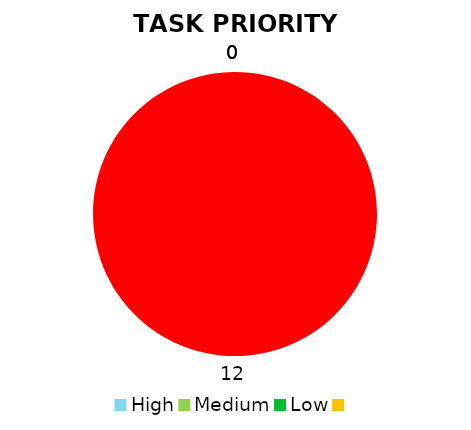
| Category | Series 1 | Series 0 |
|---|---|---|
| High | 12 | 12 |
| Medium | 0 | 0 |
| Low | 0 | 0 |